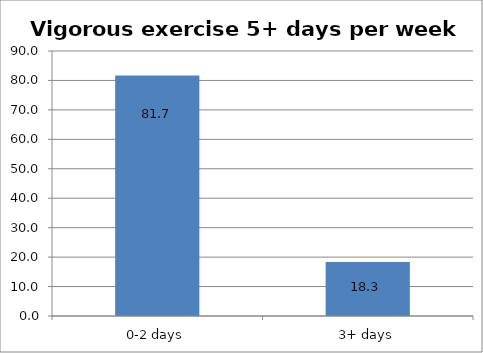
| Category | Series 0 |
|---|---|
| 0-2 days | 81.692 |
| 3+ days | 18.308 |